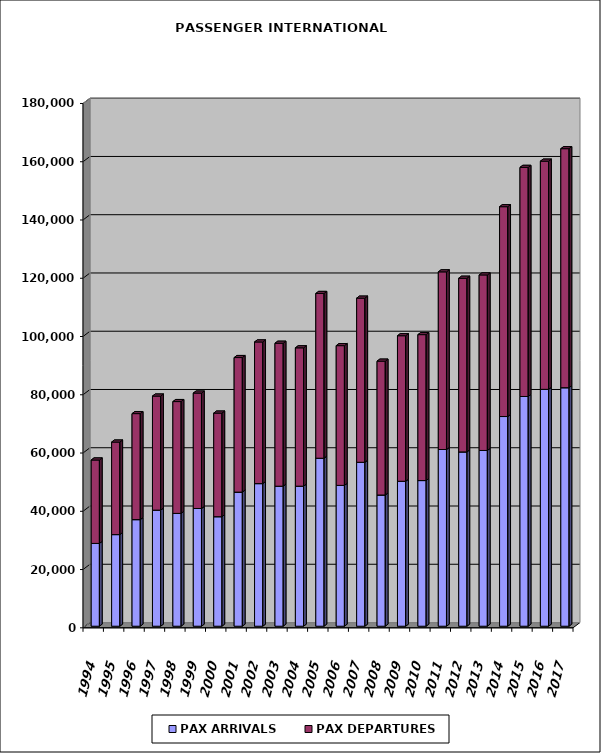
| Category | PAX ARRIVALS | PAX DEPARTURES |
|---|---|---|
| 1994.0 | 28424 | 28637 |
| 1995.0 | 31457 | 31761 |
| 1996.0 | 36598 | 36389 |
| 1997.0 | 39851 | 39159 |
| 1998.0 | 38729 | 38391 |
| 1999.0 | 40411 | 39629 |
| 2000.0 | 37605 | 35557 |
| 2001.0 | 46034 | 46197 |
| 2002.0 | 48961 | 48622 |
| 2003.0 | 48071 | 49075 |
| 2004.0 | 48073 | 47501 |
| 2005.0 | 57671 | 56564 |
| 2006.0 | 48348 | 47972 |
| 2007.0 | 56281 | 56339 |
| 2008.0 | 45050 | 45944 |
| 2009.0 | 49765 | 49963 |
| 2010.0 | 50005 | 50096 |
| 2011.0 | 60668 | 60984 |
| 2012.0 | 59845 | 59612 |
| 2013.0 | 60337 | 60258 |
| 2014.0 | 71986 | 72036 |
| 2015.0 | 78866 | 78651 |
| 2016.0 | 81322 | 78328 |
| 2017.0 | 81883 | 82054 |